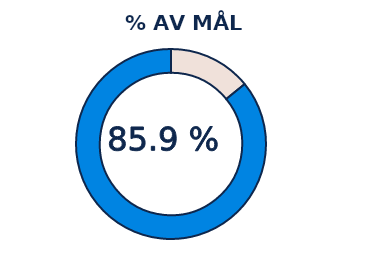
| Category | Series 1 |
|---|---|
| 0 | 0.141 |
| 1 | 0.859 |